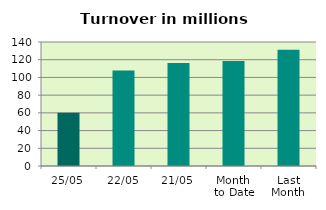
| Category | Series 0 |
|---|---|
| 25/05 | 60.164 |
| 22/05 | 107.752 |
| 21/05 | 116.329 |
| Month 
to Date | 118.586 |
| Last
Month | 131.238 |